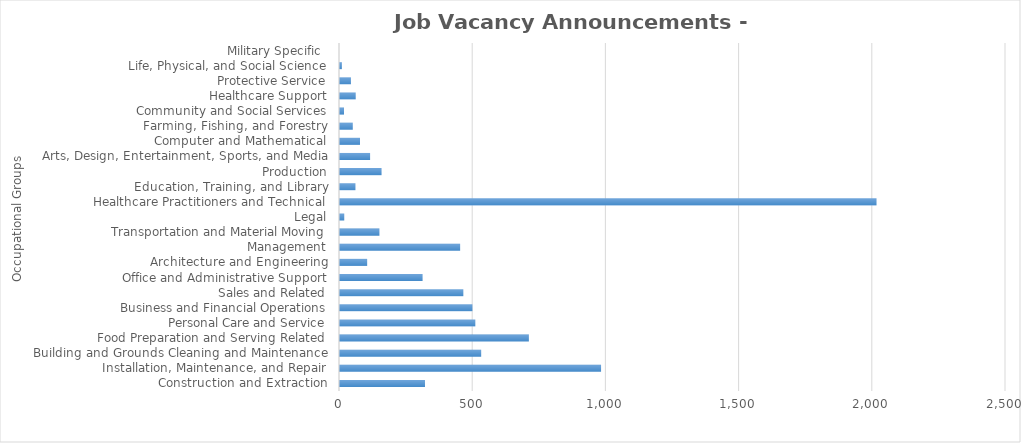
| Category | Total JVAs |
|---|---|
| Construction and Extraction | 319 |
| Installation, Maintenance, and Repair | 980 |
| Building and Grounds Cleaning and Maintenance | 530 |
| Food Preparation and Serving Related | 709 |
| Personal Care and Service | 508 |
| Business and Financial Operations | 497 |
| Sales and Related | 463 |
| Office and Administrative Support | 310 |
| Architecture and Engineering | 102 |
| Management | 451 |
| Transportation and Material Moving | 148 |
| Legal | 16 |
| Healthcare Practitioners and Technical | 2014 |
| Education, Training, and Library | 58 |
| Production | 156 |
| Arts, Design, Entertainment, Sports, and Media | 113 |
| Computer and Mathematical | 75 |
| Farming, Fishing, and Forestry | 48 |
| Community and Social Services | 15 |
| Healthcare Support | 59 |
| Protective Service | 41 |
| Life, Physical, and Social Science | 7 |
| Military Specific  | 0 |